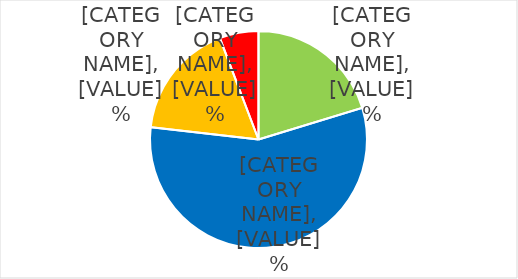
| Category | Series 0 |
|---|---|
| Normotensive | 20.29 |
| Pre-hypertensive | 56.522 |
| Stage 1 | 17.391 |
| Stage 2 | 5.797 |